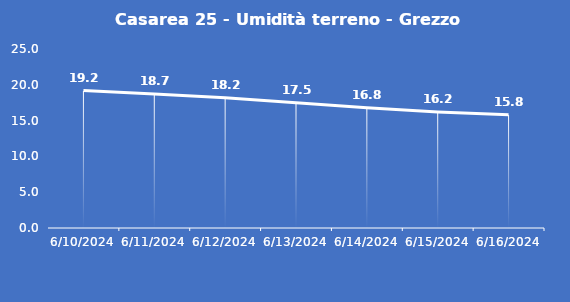
| Category | Casarea 25 - Umidità terreno - Grezzo (%VWC) |
|---|---|
| 6/10/24 | 19.2 |
| 6/11/24 | 18.7 |
| 6/12/24 | 18.2 |
| 6/13/24 | 17.5 |
| 6/14/24 | 16.8 |
| 6/15/24 | 16.2 |
| 6/16/24 | 15.8 |